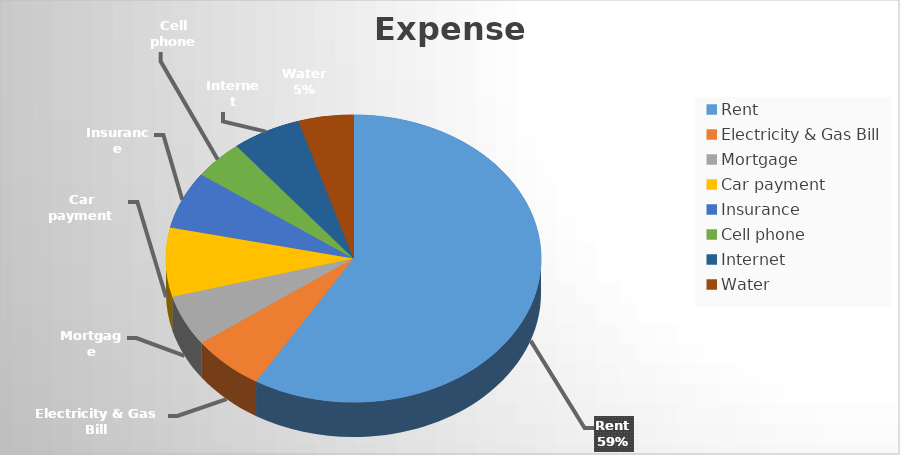
| Category | Series 0 |
|---|---|
| Rent | 14800 |
| Electricity & Gas Bill | 1597 |
| Mortgage | 1440 |
| Car payment | 1955 |
| Insurance | 1631 |
| Cell phone | 1103 |
| Internet | 1500 |
| Water | 1200 |